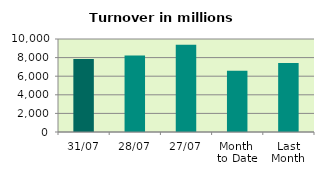
| Category | Series 0 |
|---|---|
| 31/07 | 7861.93 |
| 28/07 | 8234.224 |
| 27/07 | 9371.256 |
| Month 
to Date | 6596.564 |
| Last
Month | 7424.465 |